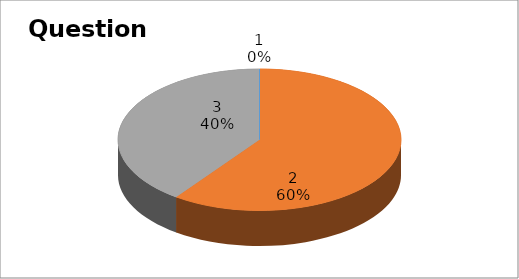
| Category | Series 0 |
|---|---|
| 0 | 0 |
| 1 | 6 |
| 2 | 4 |